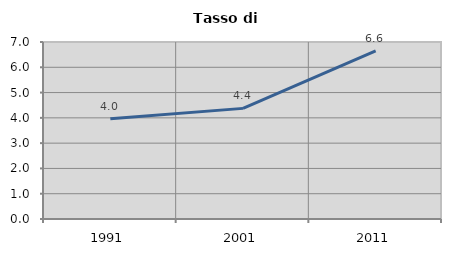
| Category | Tasso di disoccupazione   |
|---|---|
| 1991.0 | 3.966 |
| 2001.0 | 4.375 |
| 2011.0 | 6.647 |